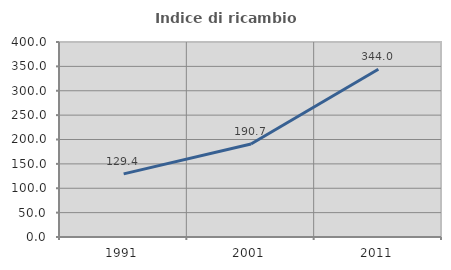
| Category | Indice di ricambio occupazionale  |
|---|---|
| 1991.0 | 129.423 |
| 2001.0 | 190.709 |
| 2011.0 | 344.031 |